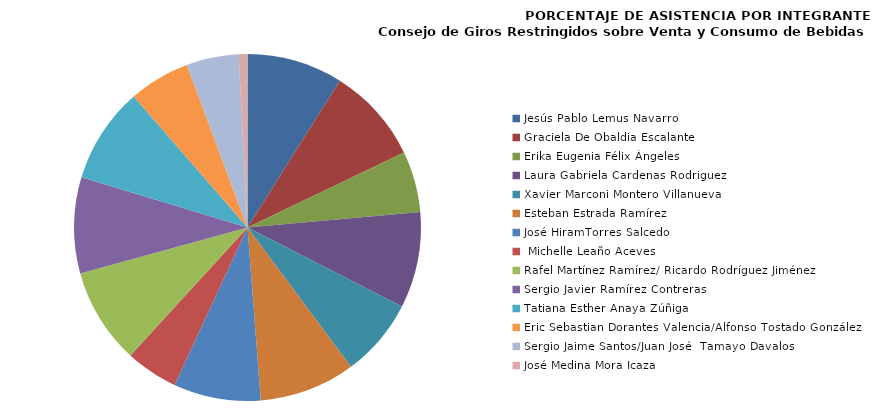
| Category | Series 0 |
|---|---|
| Jesús Pablo Lemus Navarro | 100 |
| Graciela De Obaldia Escalante | 100 |
| Erika Eugenia Félix Ángeles | 63.636 |
| Laura Gabriela Cardenas Rodriguez | 100 |
| Xavier Marconi Montero Villanueva | 81.818 |
| Esteban Estrada Ramírez | 100 |
| José HiramTorres Salcedo | 90.909 |
|  Michelle Leaño Aceves | 54.545 |
| Rafel Martínez Ramírez/ Ricardo Rodríguez Jiménez | 100 |
| Sergio Javier Ramírez Contreras | 100 |
| Tatiana Esther Anaya Zúñiga  | 100 |
| Eric Sebastian Dorantes Valencia/Alfonso Tostado González | 63.636 |
| Sergio Jaime Santos/Juan José  Tamayo Davalos | 54.545 |
| José Medina Mora Icaza | 9.091 |